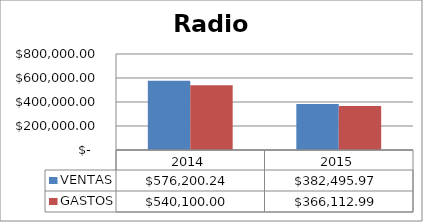
| Category | VENTAS | GASTOS |
|---|---|---|
| 2014.0 | 576200.24 | 540100 |
| 2015.0 | 382495.97 | 366112.99 |